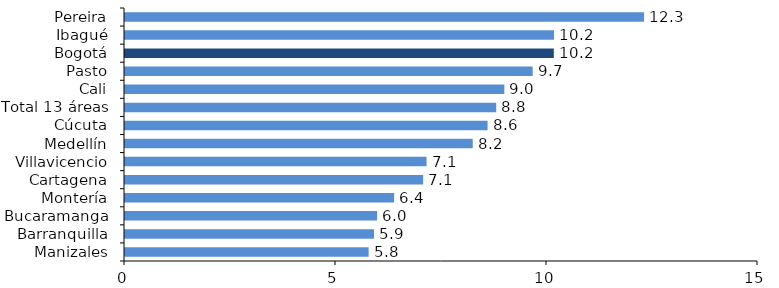
| Category | Series 0 |
|---|---|
| Pereira | 12.301 |
| Ibagué | 10.166 |
| Bogotá | 10.161 |
| Pasto | 9.66 |
| Cali | 8.99 |
| Total 13 áreas | 8.797 |
| Cúcuta | 8.592 |
| Medellín | 8.241 |
| Villavicencio | 7.145 |
| Cartagena | 7.066 |
| Montería | 6.378 |
| Bucaramanga | 5.974 |
| Barranquilla | 5.901 |
| Manizales | 5.774 |